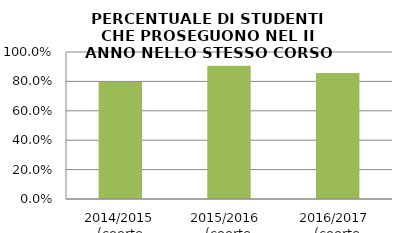
| Category | 2014/2015 (coorte 2013/14) 2015/2016  (coorte 2014/15) 2016/2017  (coorte 2015/16) |
|---|---|
| 2014/2015 (coorte 2013/14) | 0.795 |
| 2015/2016  (coorte 2014/15) | 0.907 |
| 2016/2017  (coorte 2015/16) | 0.857 |